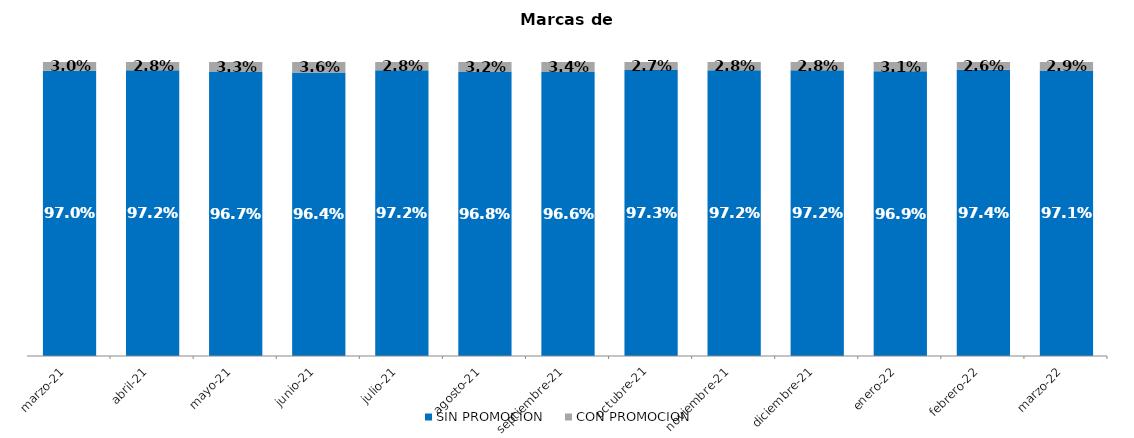
| Category | SIN PROMOCION   | CON PROMOCION   |
|---|---|---|
| 2021-03-01 | 0.97 | 0.03 |
| 2021-04-01 | 0.972 | 0.028 |
| 2021-05-01 | 0.967 | 0.033 |
| 2021-06-01 | 0.964 | 0.036 |
| 2021-07-01 | 0.972 | 0.028 |
| 2021-08-01 | 0.968 | 0.032 |
| 2021-09-01 | 0.966 | 0.034 |
| 2021-10-01 | 0.973 | 0.027 |
| 2021-11-01 | 0.972 | 0.028 |
| 2021-12-01 | 0.972 | 0.028 |
| 2022-01-01 | 0.969 | 0.031 |
| 2022-02-01 | 0.974 | 0.026 |
| 2022-03-01 | 0.971 | 0.029 |